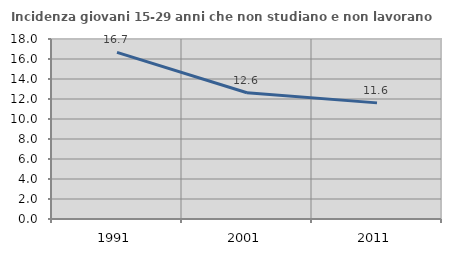
| Category | Incidenza giovani 15-29 anni che non studiano e non lavorano  |
|---|---|
| 1991.0 | 16.667 |
| 2001.0 | 12.629 |
| 2011.0 | 11.613 |